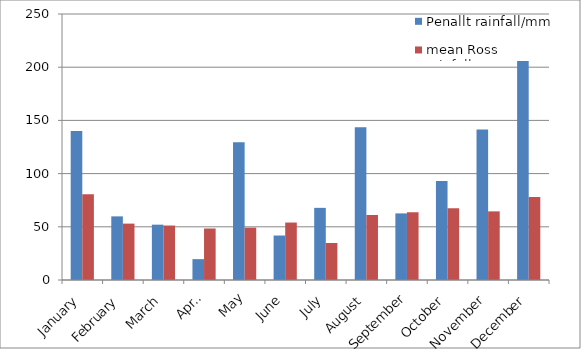
| Category | Penallt rainfall/mm | mean Ross rainfall/mm |
|---|---|---|
| January | 140 | 80.7 |
| February | 59.8 | 53 |
| March | 52 | 51.2 |
| April | 19.6 | 48.4 |
| May | 129.4 | 49.2 |
| June | 41.8 | 54 |
| July | 67.8 | 34.8 |
| August | 143.6 | 61.1 |
| September | 62.6 | 63.7 |
| October | 93 | 67.5 |
| November | 141.4 | 64.5 |
| December | 236 | 78.1 |